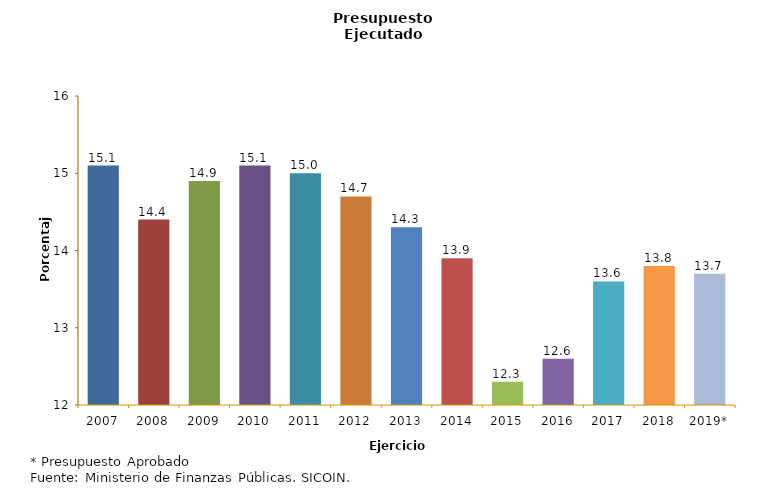
| Category | Series 0 |
|---|---|
| 2007 | 15.1 |
| 2008 | 14.4 |
| 2009 | 14.9 |
| 2010 | 15.1 |
| 2011 | 15 |
| 2012 | 14.7 |
| 2013 | 14.3 |
| 2014 | 13.9 |
| 2015 | 12.3 |
| 2016 | 12.6 |
| 2017 | 13.6 |
| 2018 | 13.8 |
| 2019* | 13.7 |